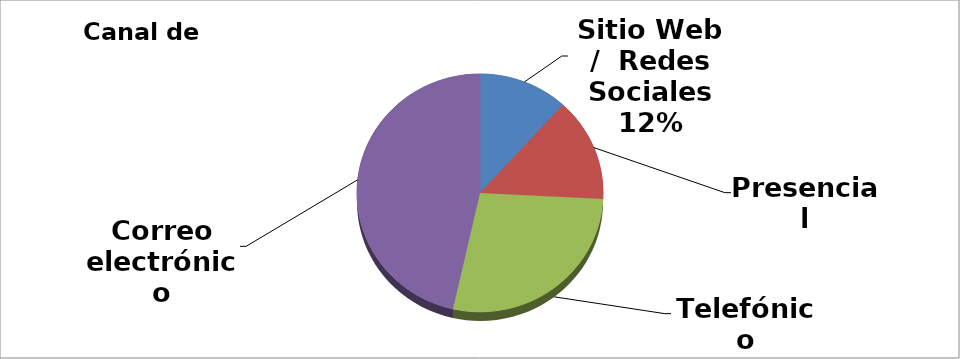
| Category | Series 0 |
|---|---|
| Sitio Web /  Redes Sociales | 25 |
| Presencial | 30 |
| Telefónico | 59 |
| Correo electrónico | 99 |